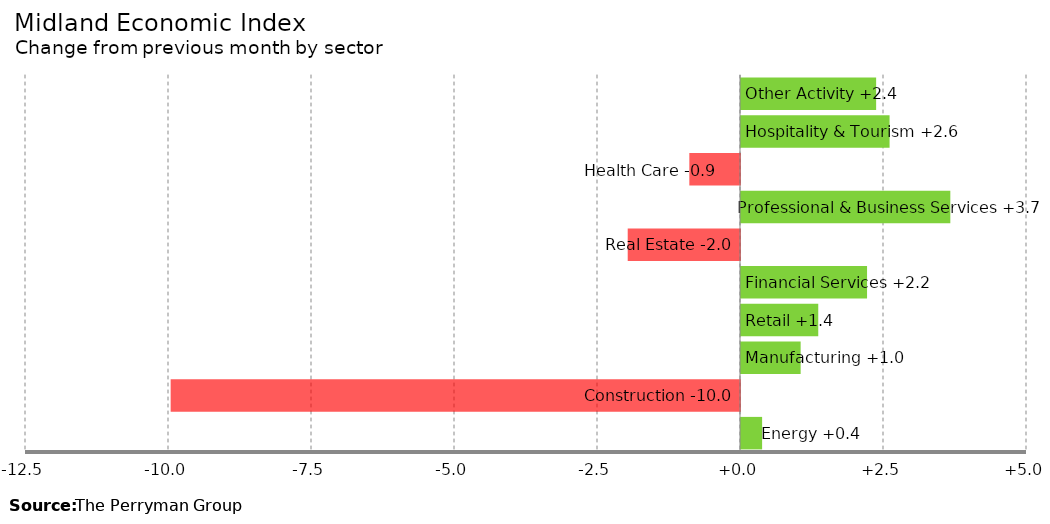
| Category | Change |
|---|---|
| Energy | 0.369 |
| Construction | -9.954 |
| Manufacturing | 1.043 |
| Retail | 1.351 |
| Financial Services | 2.204 |
| Real Estate | -1.963 |
| Professional & Business Services | 3.659 |
| Health Care | -0.886 |
| Hospitality & Tourism | 2.597 |
| Other Activity | 2.362 |